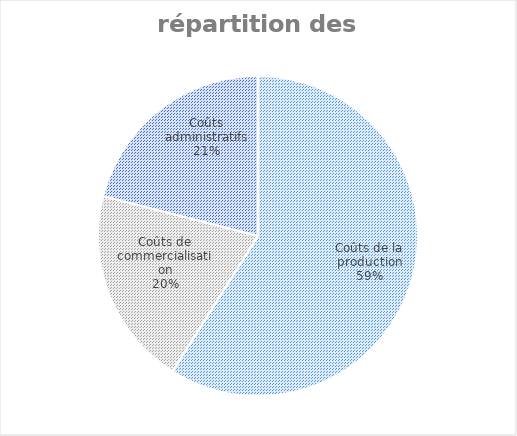
| Category | Series 0 |
|---|---|
| Coûts de la production | 25000 |
| Coûts de commercialisation | 8500 |
| Coûts administratifs | 8900 |